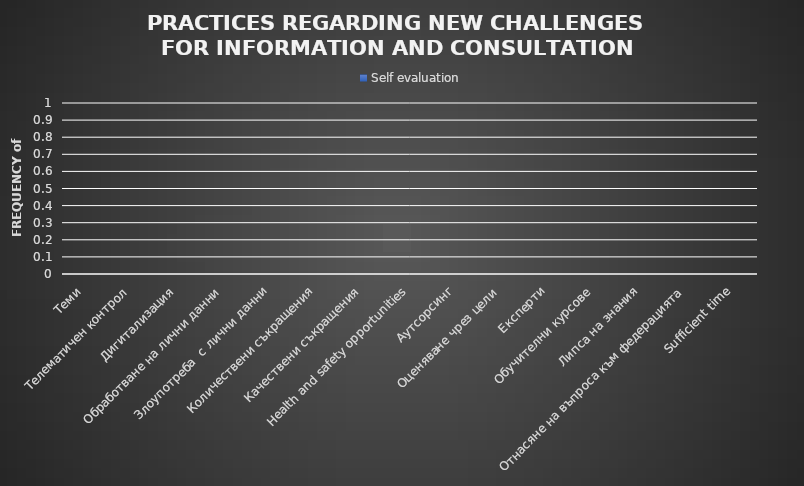
| Category | Self evaluation |
|---|---|
| Теми | 0 |
| Телематичен контрол | 0 |
| Дигитализация | 0 |
| Обработване на лични данни | 0 |
| Злоупотреба  с лични данни | 0 |
| Количествени съкращения | 0 |
| Качествени съкращения | 0 |
| Health and safety opportunities | 0 |
| Аутсорсинг | 0 |
| Оценяване чрез цели | 0 |
| Експерти | 0 |
| Обучителни курсове | 0 |
| Липса на знания | 0 |
| Отнасяне на въпроса към федерацията | 0 |
| Sufficient time | 0 |